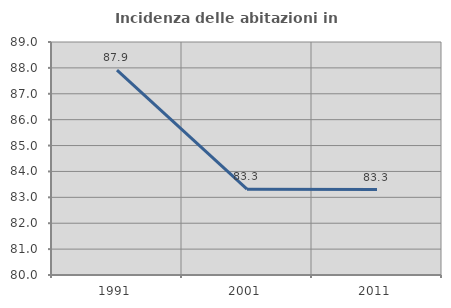
| Category | Incidenza delle abitazioni in proprietà  |
|---|---|
| 1991.0 | 87.917 |
| 2001.0 | 83.314 |
| 2011.0 | 83.302 |